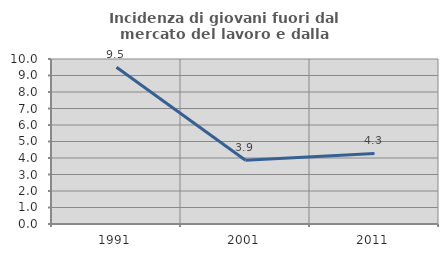
| Category | Incidenza di giovani fuori dal mercato del lavoro e dalla formazione  |
|---|---|
| 1991.0 | 9.502 |
| 2001.0 | 3.866 |
| 2011.0 | 4.276 |